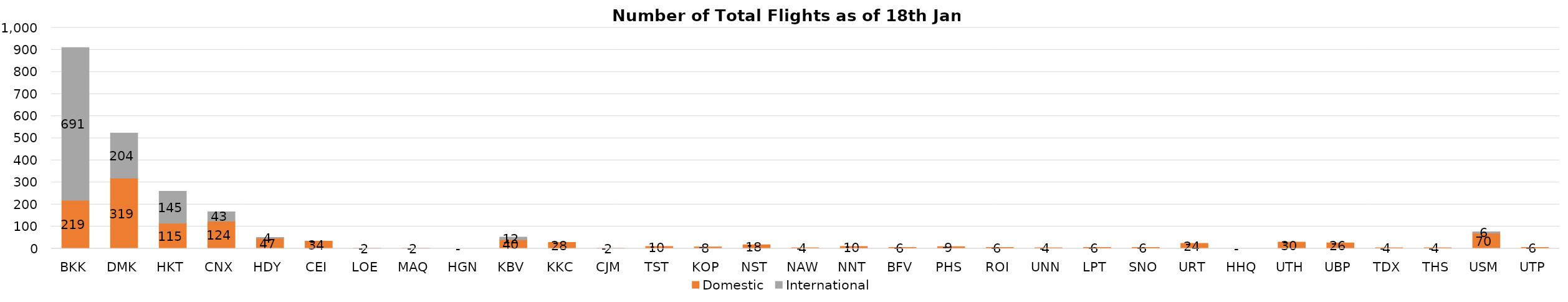
| Category | Domestic | International |
|---|---|---|
| BKK | 219 | 691 |
| DMK | 319 | 204 |
| HKT | 115 | 145 |
| CNX | 124 | 43 |
| HDY | 47 | 4 |
| CEI | 34 | 0 |
| LOE | 2 | 0 |
| MAQ | 2 | 0 |
| HGN | 0 | 0 |
| KBV | 40 | 12 |
| KKC | 28 | 0 |
| CJM | 2 | 0 |
| TST | 10 | 0 |
| KOP | 8 | 0 |
| NST | 18 | 0 |
| NAW | 4 | 0 |
| NNT | 10 | 0 |
| BFV | 6 | 0 |
| PHS | 9 | 0 |
| ROI | 6 | 0 |
| UNN | 4 | 0 |
| LPT | 6 | 0 |
| SNO | 6 | 0 |
| URT | 24 | 0 |
| HHQ | 0 | 0 |
| UTH | 30 | 0 |
| UBP | 26 | 0 |
| TDX | 4 | 0 |
| THS | 4 | 0 |
| USM | 70 | 6 |
| UTP | 6 | 0 |